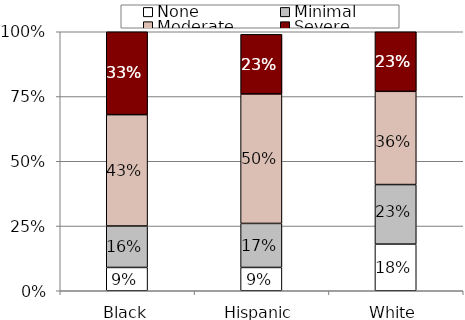
| Category | None | Minimal | Moderate | Severe |
|---|---|---|---|---|
| Black | 0.09 | 0.16 | 0.43 | 0.33 |
| Hispanic | 0.09 | 0.17 | 0.5 | 0.23 |
| White | 0.18 | 0.23 | 0.36 | 0.23 |